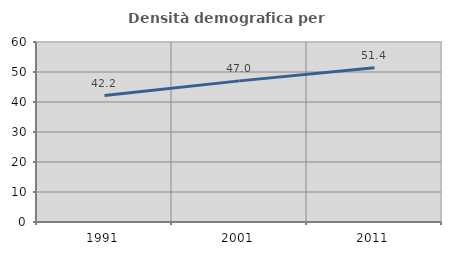
| Category | Densità demografica |
|---|---|
| 1991.0 | 42.162 |
| 2001.0 | 47.042 |
| 2011.0 | 51.404 |